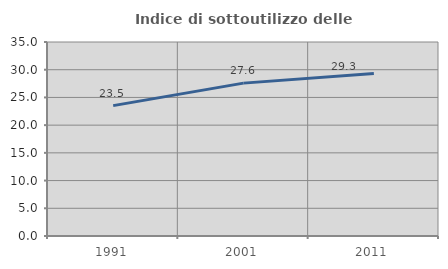
| Category | Indice di sottoutilizzo delle abitazioni  |
|---|---|
| 1991.0 | 23.519 |
| 2001.0 | 27.581 |
| 2011.0 | 29.317 |